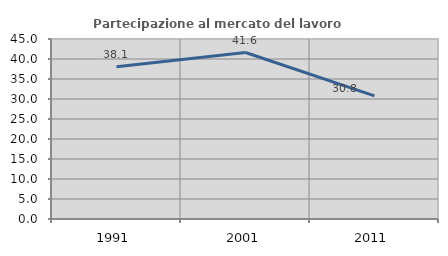
| Category | Partecipazione al mercato del lavoro  femminile |
|---|---|
| 1991.0 | 38.09 |
| 2001.0 | 41.616 |
| 2011.0 | 30.799 |